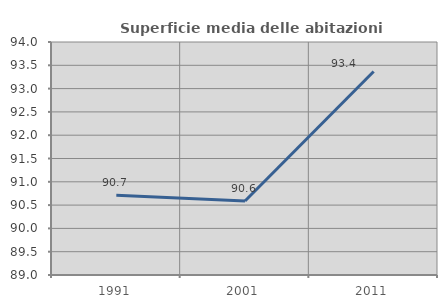
| Category | Superficie media delle abitazioni occupate |
|---|---|
| 1991.0 | 90.711 |
| 2001.0 | 90.589 |
| 2011.0 | 93.366 |